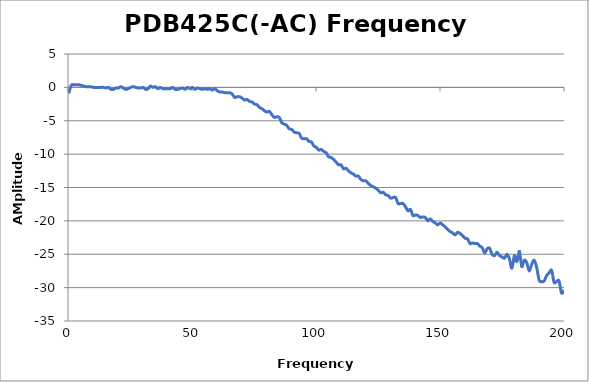
| Category | Series 0 |
|---|---|
| 0.3 | -0.9 |
| 1.3 | 0.3 |
| 2.3 | 0.4 |
| 3.3 | 0.4 |
| 4.3 | 0.4 |
| 5.3 | 0.3 |
| 6.3 | 0.2 |
| 7.3 | 0.1 |
| 8.3 | 0.1 |
| 9.3 | 0.1 |
| 10.3 | 0 |
| 11.3 | 0 |
| 12.3 | 0 |
| 13.3 | 0 |
| 14.3 | 0 |
| 15.3 | -0.1 |
| 16.3 | 0 |
| 17.3 | -0.3 |
| 18.3 | -0.3 |
| 19.3 | -0.1 |
| 20.3 | -0.1 |
| 21.3 | 0.1 |
| 22.3 | -0.1 |
| 23.3 | -0.3 |
| 24.3 | -0.2 |
| 25.3 | 0 |
| 26.3 | 0.1 |
| 27.3 | 0 |
| 28.3 | -0.1 |
| 29.3 | -0.1 |
| 30.3 | 0 |
| 31.3 | -0.3 |
| 32.3 | -0.2 |
| 33.3 | 0.2 |
| 34.2 | 0 |
| 35.2 | 0.1 |
| 36.2 | -0.2 |
| 37.2 | 0 |
| 38.2 | -0.2 |
| 39.2 | -0.2 |
| 40.2 | -0.2 |
| 41.2 | -0.2 |
| 42.2 | 0 |
| 43.2 | -0.3 |
| 44.2 | -0.3 |
| 45.2 | -0.2 |
| 46.2 | -0.1 |
| 47.2 | -0.3 |
| 48.2 | 0 |
| 49.2 | -0.2 |
| 50.2 | 0 |
| 51.2 | -0.3 |
| 52.2 | -0.1 |
| 53.2 | -0.2 |
| 54.2 | -0.3 |
| 55.2 | -0.2 |
| 56.2 | -0.3 |
| 57.2 | -0.2 |
| 58.2 | -0.4 |
| 59.2 | -0.2 |
| 60.2 | -0.5 |
| 61.2 | -0.7 |
| 62.2 | -0.7 |
| 63.2 | -0.8 |
| 64.2 | -0.8 |
| 65.2 | -0.8 |
| 66.2 | -1 |
| 67.2 | -1.5 |
| 68.2 | -1.4 |
| 69.2 | -1.4 |
| 70.2 | -1.6 |
| 71.2 | -1.9 |
| 72.2 | -1.8 |
| 73.2 | -2.1 |
| 74.2 | -2.2 |
| 75.2 | -2.5 |
| 76.2 | -2.6 |
| 77.2 | -3 |
| 78.2 | -3.2 |
| 79.2 | -3.5 |
| 80.2 | -3.7 |
| 81.2 | -3.6 |
| 82.2 | -4.1 |
| 83.2 | -4.5 |
| 84.2 | -4.4 |
| 85.2 | -4.5 |
| 86.2 | -5.3 |
| 87.2 | -5.5 |
| 88.2 | -5.7 |
| 89.2 | -6.2 |
| 90.2 | -6.3 |
| 91.2 | -6.7 |
| 92.2 | -6.8 |
| 93.2 | -6.9 |
| 94.2 | -7.6 |
| 95.2 | -7.7 |
| 96.2 | -7.7 |
| 97.2 | -8.1 |
| 98.2 | -8.2 |
| 99.2 | -8.8 |
| 100.2 | -9 |
| 101.1 | -9.4 |
| 102.1 | -9.3 |
| 103.1 | -9.6 |
| 104.1 | -9.8 |
| 105.1 | -10.4 |
| 106.1 | -10.5 |
| 107.1 | -10.8 |
| 108.1 | -11.2 |
| 109.1 | -11.6 |
| 110.1 | -11.6 |
| 111.1 | -12.2 |
| 112.1 | -12.1 |
| 113.1 | -12.5 |
| 114.1 | -12.8 |
| 115.1 | -13 |
| 116.1 | -13.3 |
| 117.1 | -13.3 |
| 118.1 | -13.8 |
| 119.1 | -14 |
| 120.1 | -14 |
| 121.1 | -14.4 |
| 122.1 | -14.7 |
| 123.1 | -14.9 |
| 124.1 | -15.1 |
| 125.1 | -15.4 |
| 126.1 | -15.8 |
| 127.1 | -15.7 |
| 128.1 | -16.1 |
| 129.1 | -16.2 |
| 130.1 | -16.6 |
| 131.1 | -16.5 |
| 132.1 | -16.5 |
| 133.1 | -17.4 |
| 134.1 | -17.4 |
| 135.1 | -17.4 |
| 136.1 | -17.9 |
| 137.1 | -18.5 |
| 138.1 | -18.3 |
| 139.1 | -19.2 |
| 140.1 | -19.1 |
| 141.1 | -19.2 |
| 142.1 | -19.5 |
| 143.1 | -19.4 |
| 144.1 | -19.5 |
| 145.1 | -20 |
| 146.1 | -19.7 |
| 147.1 | -20.1 |
| 148.1 | -20.3 |
| 149.1 | -20.6 |
| 150.1 | -20.3 |
| 151.1 | -20.6 |
| 152.1 | -20.9 |
| 153.1 | -21.3 |
| 154.1 | -21.6 |
| 155.1 | -21.8 |
| 156.1 | -22.1 |
| 157.1 | -21.7 |
| 158.1 | -21.9 |
| 159.1 | -22.2 |
| 160.1 | -22.6 |
| 161.1 | -22.7 |
| 162.1 | -23.4 |
| 163.1 | -23.3 |
| 164.1 | -23.4 |
| 165.1 | -23.4 |
| 166.1 | -23.8 |
| 167.0 | -24 |
| 168.0 | -24.8 |
| 169.0 | -24.2 |
| 170.0 | -24.1 |
| 171.0 | -25 |
| 172.0 | -25.2 |
| 173.0 | -24.7 |
| 174.0 | -25.2 |
| 175.0 | -25.4 |
| 176.0 | -25.6 |
| 177.0 | -25 |
| 178.0 | -25.7 |
| 179.0 | -27.1 |
| 180.0 | -25.2 |
| 181.0 | -26.1 |
| 182.0 | -24.4 |
| 183.0 | -27 |
| 184.0 | -25.9 |
| 185.0 | -26.3 |
| 186.0 | -27.5 |
| 187.0 | -26.5 |
| 188.0 | -25.9 |
| 189.0 | -27 |
| 190.0 | -28.9 |
| 191.0 | -29.1 |
| 192.0 | -29 |
| 193.0 | -28.2 |
| 194.0 | -27.8 |
| 195.0 | -27.4 |
| 196.0 | -29.2 |
| 197.0 | -29.1 |
| 198.0 | -29 |
| 199.0 | -30.8 |
| 200.0 | -30.4 |